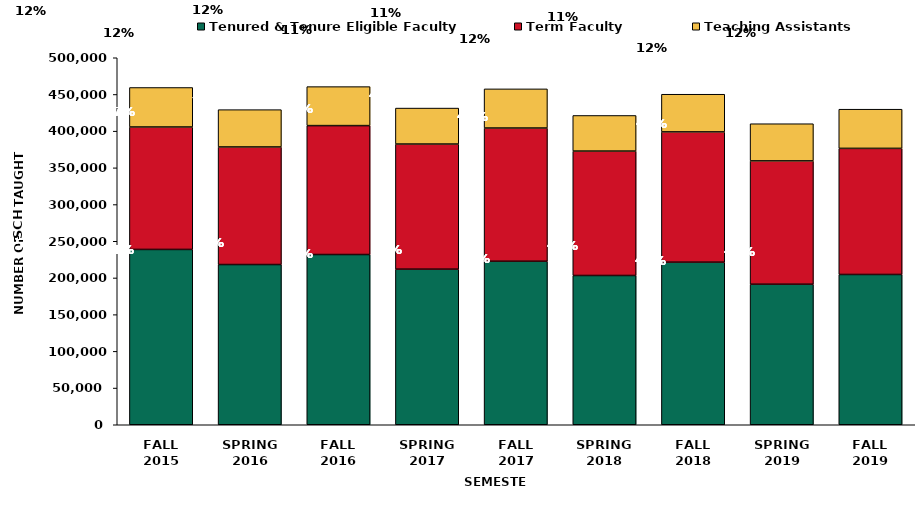
| Category | Tenured & Tenure Eligible Faculty | Term Faculty | Teaching Assistants |
|---|---|---|---|
| FALL
2015 | 238831 | 166827.4 | 53818.6 |
| SPRING
2016 | 218266.1 | 160199.7 | 50835.7 |
| FALL
2016 | 231916.8 | 175652.3 | 53107 |
| SPRING
2017 | 211957 | 170476.6 | 49016 |
| FALL
2017 | 222732 | 181530.5 | 53325 |
| SPRING
2018 | 203344 | 169521.9 | 48517 |
| FALL
2018 | 221462.6 | 177514.4 | 51337.1 |
| SPRING
2019 | 191437.3 | 168047.8 | 50631 |
| FALL
2019 | 204740.7 | 171799.4 | 53370.6 |